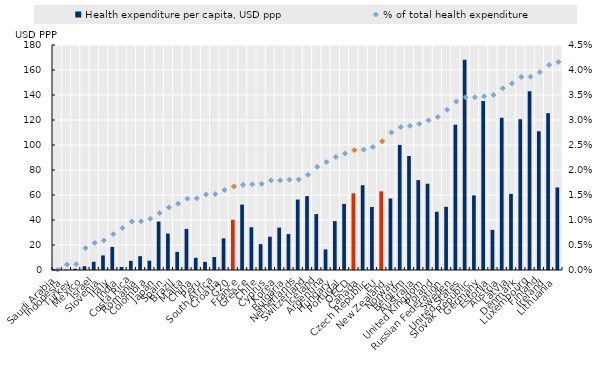
| Category | Health expenditure per capita, USD ppp |
|---|---|
| Saudi Arabia | 0.107 |
| Indonesia | 0.393 |
| Turkey | 0.978 |
| Mexico | 3.02 |
| Israel | 6.589 |
| Slovenia | 11.65 |
| Italy | 18.458 |
| India | 2.452 |
| Costa Rica | 7.308 |
| Romania | 11.067 |
| Colombia | 7.483 |
| Japan | 38.765 |
| Spain | 29.144 |
| Brazil | 14.49 |
| Malta | 32.866 |
| China | 9.77 |
| Peru | 6.515 |
| South Africa | 10.362 |
| Croatia | 25.354 |
| G20 | 40.229 |
| France | 52.32 |
| Greece | 34.203 |
| Chile | 20.684 |
| Cyprus | 26.628 |
| Korea | 33.909 |
| Bulgaria | 28.723 |
| Netherlands | 56.353 |
| Switzerland | 59.121 |
| Iceland | 44.728 |
| Argentina | 16.468 |
| Hungary | 39.116 |
| Portugal | 52.877 |
| OECD | 61.353 |
| Canada | 67.81 |
| Czech Republic | 50.448 |
| EU | 62.933 |
| New Zealand | 57.172 |
| Norway | 100.109 |
| Belgium | 91.238 |
| Australia | 71.929 |
| United Kingdom | 68.994 |
| Poland | 46.6 |
| Russian Federation | 50.567 |
| Sweden | 116.201 |
| United States | 168.26 |
| Slovak Republic | 59.677 |
| Germany | 135.298 |
| Estonia | 32.089 |
| Austria | 121.862 |
| Latvia | 60.896 |
| Denmark | 120.623 |
| Luxembourg | 143.008 |
| Finland | 111.026 |
| Ireland | 125.461 |
| Lithuania | 66.003 |